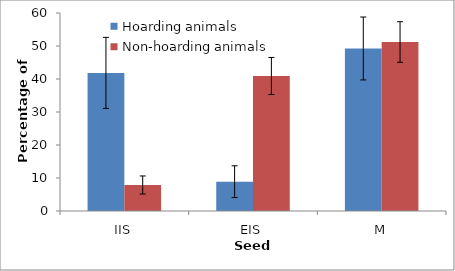
| Category | Hoarding animals | Non-hoarding animals |
|---|---|---|
| IIS | 41.85 | 7.88 |
| EIS | 8.89 | 40.91 |
| M | 49.25 | 51.21 |